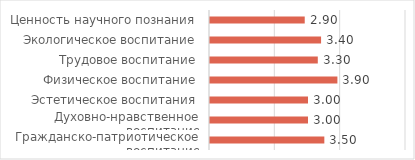
| Category | Средний
 балл |
|---|---|
| Гражданско-патриотическое воспитание | 3.5 |
| Духовно-нравственное воспитание | 3 |
| Эстетическое воспитания | 3 |
| Физическое воспитание | 3.9 |
| Трудовое воспитание | 3.3 |
| Экологическое воспитание | 3.4 |
| Ценность научного познания | 2.9 |